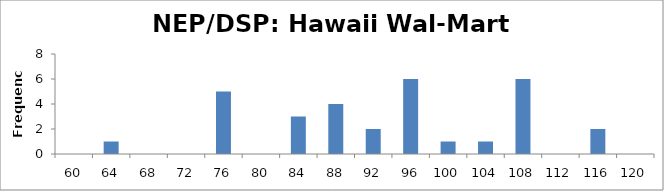
| Category | Frequency |
|---|---|
| 60.0 | 0 |
| 64.0 | 1 |
| 68.0 | 0 |
| 72.0 | 0 |
| 76.0 | 5 |
| 80.0 | 0 |
| 84.0 | 3 |
| 88.0 | 4 |
| 92.0 | 2 |
| 96.0 | 6 |
| 100.0 | 1 |
| 104.0 | 1 |
| 108.0 | 6 |
| 112.0 | 0 |
| 116.0 | 2 |
| 120.0 | 0 |